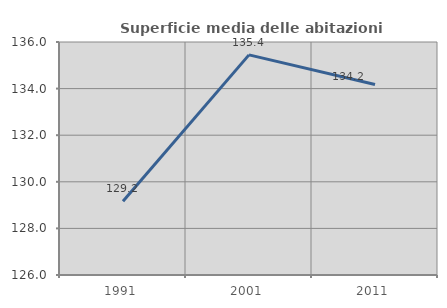
| Category | Superficie media delle abitazioni occupate |
|---|---|
| 1991.0 | 129.163 |
| 2001.0 | 135.448 |
| 2011.0 | 134.173 |